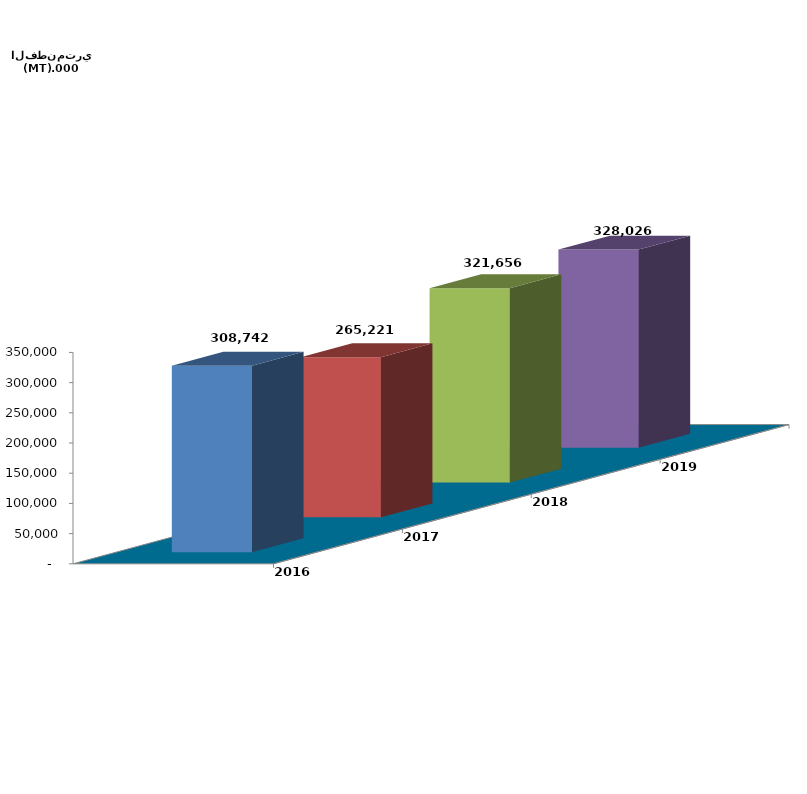
| Category | 2016 | 2017 | 2018 | 2019 |
|---|---|---|---|---|
| 0 | 308741.808 | 265220.521 | 321655.847 | 328026.378 |